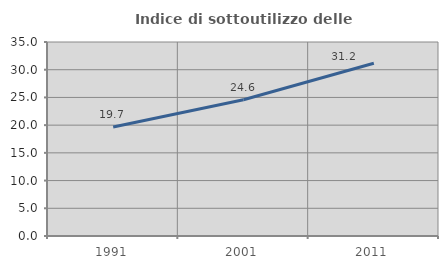
| Category | Indice di sottoutilizzo delle abitazioni  |
|---|---|
| 1991.0 | 19.663 |
| 2001.0 | 24.588 |
| 2011.0 | 31.162 |